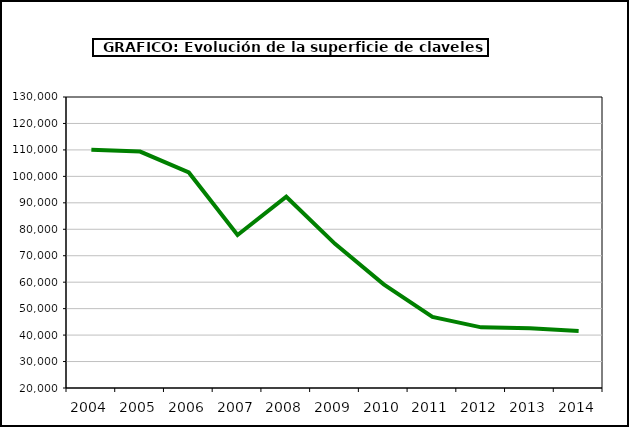
| Category | superficie |
|---|---|
| 2004.0 | 110091 |
| 2005.0 | 109381 |
| 2006.0 | 101473 |
| 2007.0 | 77836 |
| 2008.0 | 92310 |
| 2009.0 | 74481 |
| 2010.0 | 59199 |
| 2011.0 | 46860 |
| 2012.0 | 42920 |
| 2013.0 | 42572 |
| 2014.0 | 41501 |